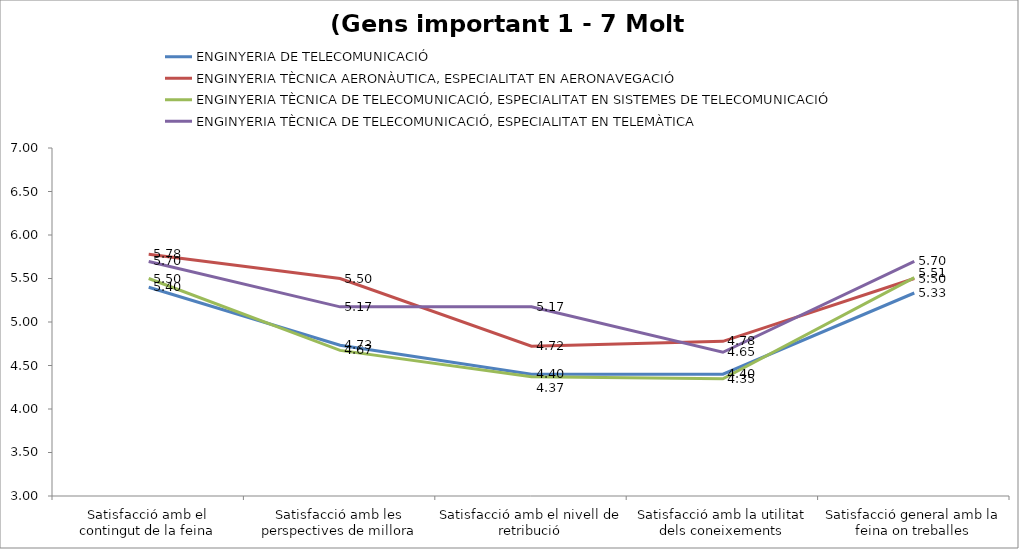
| Category | ENGINYERIA DE TELECOMUNICACIÓ | ENGINYERIA TÈCNICA AERONÀUTICA, ESPECIALITAT EN AERONAVEGACIÓ | ENGINYERIA TÈCNICA DE TELECOMUNICACIÓ, ESPECIALITAT EN SISTEMES DE TELECOMUNICACIÓ | ENGINYERIA TÈCNICA DE TELECOMUNICACIÓ, ESPECIALITAT EN TELEMÀTICA |
|---|---|---|---|---|
| Satisfacció amb el contingut de la feina | 5.4 | 5.778 | 5.5 | 5.696 |
| Satisfacció amb les perspectives de millora | 4.733 | 5.5 | 4.674 | 5.174 |
| Satisfacció amb el nivell de retribució | 4.4 | 4.722 | 4.37 | 5.174 |
| Satisfacció amb la utilitat dels coneixements | 4.4 | 4.778 | 4.348 | 4.652 |
| Satisfacció general amb la feina on treballes | 5.333 | 5.5 | 5.511 | 5.696 |